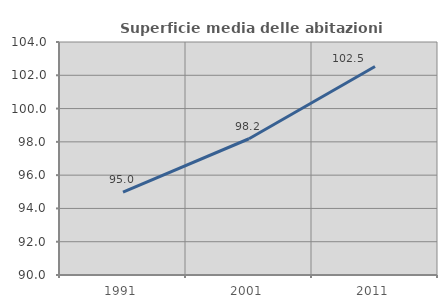
| Category | Superficie media delle abitazioni occupate |
|---|---|
| 1991.0 | 94.975 |
| 2001.0 | 98.187 |
| 2011.0 | 102.526 |